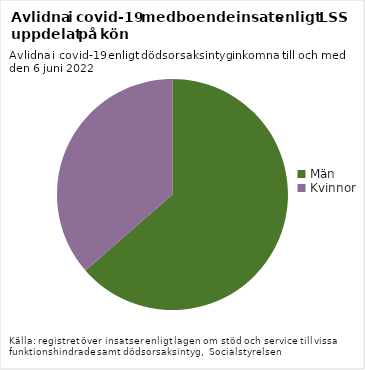
| Category | Kön |
|---|---|
| Män | 89 |
| Kvinnor | 51 |